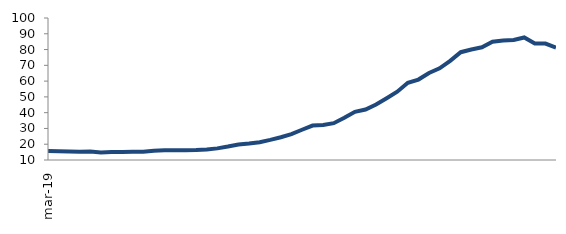
| Category | Series 0 |
|---|---|
| 2019-03-01 | 15.762 |
| 2019-04-01 | 15.486 |
| 2019-05-01 | 15.319 |
| 2019-06-01 | 15.27 |
| 2019-07-01 | 15.317 |
| 2019-08-01 | 14.744 |
| 2019-09-01 | 15.056 |
| 2019-10-01 | 15.116 |
| 2019-11-01 | 15.185 |
| 2019-12-01 | 15.165 |
| 2020-01-01 | 15.917 |
| 2020-02-01 | 16.225 |
| 2020-03-01 | 16.228 |
| 2020-04-01 | 16.172 |
| 2020-05-01 | 16.362 |
| 2020-06-01 | 16.723 |
| 2020-07-01 | 17.365 |
| 2020-08-01 | 18.526 |
| 2020-09-01 | 19.846 |
| 2020-10-01 | 20.404 |
| 2020-11-01 | 21.294 |
| 2020-12-01 | 22.781 |
| 2021-01-01 | 24.447 |
| 2021-02-01 | 26.406 |
| 2021-03-01 | 29.172 |
| 2021-04-01 | 31.839 |
| 2021-05-01 | 32.208 |
| 2021-06-01 | 33.334 |
| 2021-07-01 | 36.745 |
| 2021-08-01 | 40.523 |
| 2021-09-01 | 41.963 |
| 2021-10-01 | 45.141 |
| 2021-11-01 | 49.115 |
| 2021-12-01 | 53.284 |
| 2022-01-01 | 58.918 |
| 2022-02-01 | 60.986 |
| 2022-03-01 | 65.12 |
| 2022-04-01 | 68.133 |
| 2022-05-01 | 72.877 |
| 2022-06-01 | 78.33 |
| 2022-07-01 | 80.069 |
| 2022-08-01 | 81.469 |
| 2022-09-01 | 84.915 |
| 2022-10-01 | 85.787 |
| 2022-11-01 | 86.039 |
| 2022-12-01 | 87.664 |
| 2023-01-01 | 83.881 |
| 2023-02-01 | 83.774 |
| 2023-03-01 | 81.297 |